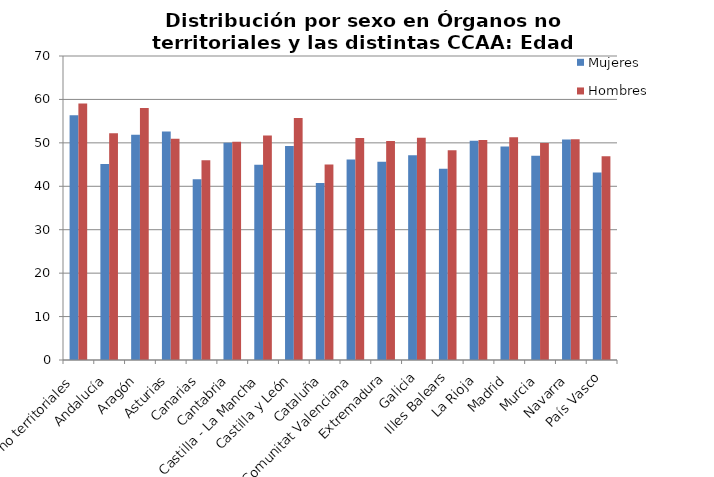
| Category | Mujeres | Hombres |
|---|---|---|
| Órganos no territoriales | 56.354 | 59.08 |
| Andalucía | 45.127 | 52.24 |
| Aragón | 51.846 | 58.045 |
| Asturias | 52.607 | 50.955 |
| Canarias | 41.612 | 46.018 |
| Cantabria | 50 | 50.25 |
| Castilla - La Mancha | 44.967 | 51.714 |
| Castilla y León | 49.282 | 55.705 |
| Cataluña | 40.733 | 45.038 |
| Comunitat Valenciana | 46.19 | 51.144 |
| Extremadura | 45.633 | 50.44 |
| Galicia | 47.12 | 51.17 |
| Illes Balears | 44.023 | 48.286 |
| La Rioja | 50.5 | 50.667 |
| Madrid | 49.163 | 51.279 |
| Murcia | 47.048 | 49.957 |
| Navarra | 50.8 | 50.833 |
| País Vasco | 43.192 | 46.9 |